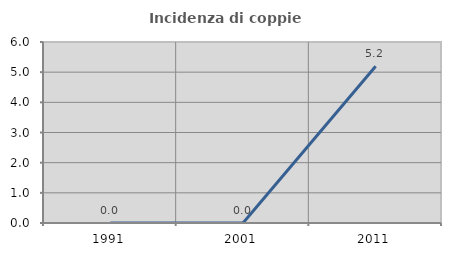
| Category | Incidenza di coppie miste |
|---|---|
| 1991.0 | 0 |
| 2001.0 | 0 |
| 2011.0 | 5.195 |